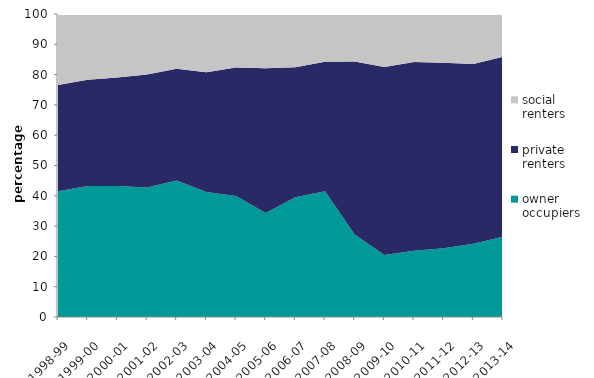
| Category | owner occupiers | private renters | social renters |
|---|---|---|---|
| 1998-99 | 41.501 | 35.091 | 23.408 |
| 1999-00 | 43.25 | 35.083 | 21.667 |
| 2000-01 | 43.217 | 35.862 | 20.921 |
| 2001-02 | 42.756 | 37.24 | 20.004 |
| 2002-03 | 45.015 | 36.889 | 18.096 |
| 2003-04 | 41.291 | 39.502 | 19.207 |
| 2004-05 | 39.957 | 42.427 | 17.616 |
| 2005-06 | 34.328 | 47.749 | 17.922 |
| 2006-07 | 39.521 | 42.882 | 17.597 |
| 2007-08 | 41.518 | 42.725 | 15.758 |
| 2008-09 | 27.261 | 57.049 | 15.691 |
| 2009-10 | 20.492 | 61.98 | 17.528 |
| 2010-11 | 21.898 | 62.224 | 15.878 |
| 2011-12 | 22.682 | 61.264 | 16.054 |
| 2012-13 | 24.148 | 59.388 | 16.464 |
| 2013-14 | 26.5 | 59.38 | 14.119 |